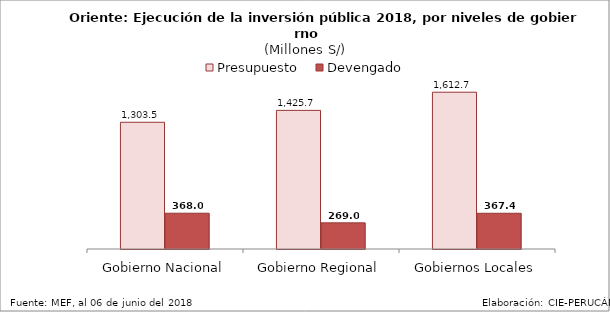
| Category | Presupuesto | Devengado |
|---|---|---|
| Gobierno Nacional | 1303.475 | 367.99 |
| Gobierno Regional | 1425.71 | 269 |
| Gobiernos Locales | 1612.701 | 367.397 |